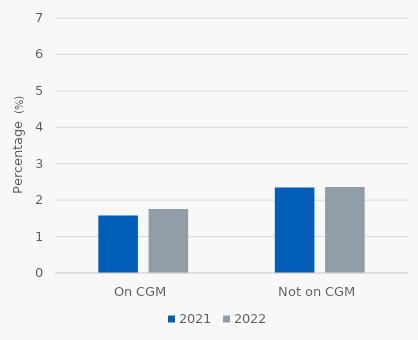
| Category | 2021 | 2022 |
|---|---|---|
| On CGM | 1.579 | 1.754 |
| Not on CGM | 2.347 | 2.362 |